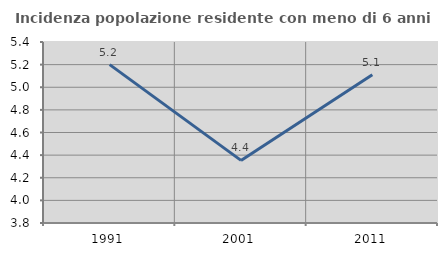
| Category | Incidenza popolazione residente con meno di 6 anni |
|---|---|
| 1991.0 | 5.2 |
| 2001.0 | 4.353 |
| 2011.0 | 5.11 |